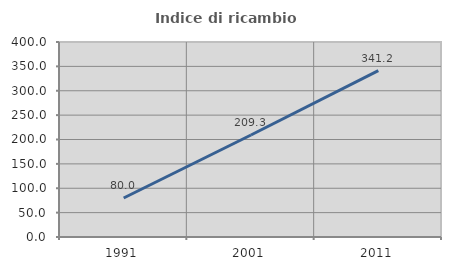
| Category | Indice di ricambio occupazionale  |
|---|---|
| 1991.0 | 80 |
| 2001.0 | 209.259 |
| 2011.0 | 341.176 |